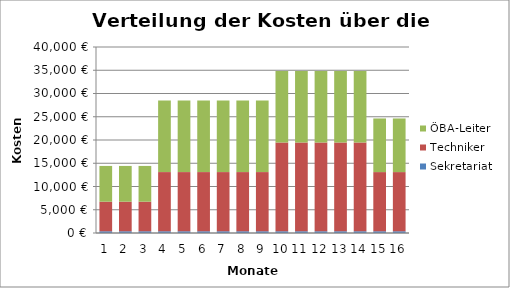
| Category | Sekretariat | Techniker | ÖBA-Leiter |
|---|---|---|---|
| 0 | 371.211 | 6363.61 | 7689.362 |
| 1 | 371.211 | 6363.61 | 7689.362 |
| 2 | 371.211 | 6363.61 | 7689.362 |
| 3 | 371.211 | 12727.22 | 15378.725 |
| 4 | 371.211 | 12727.22 | 15378.725 |
| 5 | 371.211 | 12727.22 | 15378.725 |
| 6 | 371.211 | 12727.22 | 15378.725 |
| 7 | 371.211 | 12727.22 | 15378.725 |
| 8 | 371.211 | 12727.22 | 15378.725 |
| 9 | 371.211 | 19090.831 | 15378.725 |
| 10 | 371.211 | 19090.831 | 15378.725 |
| 11 | 371.211 | 19090.831 | 15378.725 |
| 12 | 371.211 | 19090.831 | 15378.725 |
| 13 | 371.211 | 19090.831 | 15378.725 |
| 14 | 371.211 | 12727.22 | 11534.044 |
| 15 | 371.211 | 12727.22 | 11534.044 |